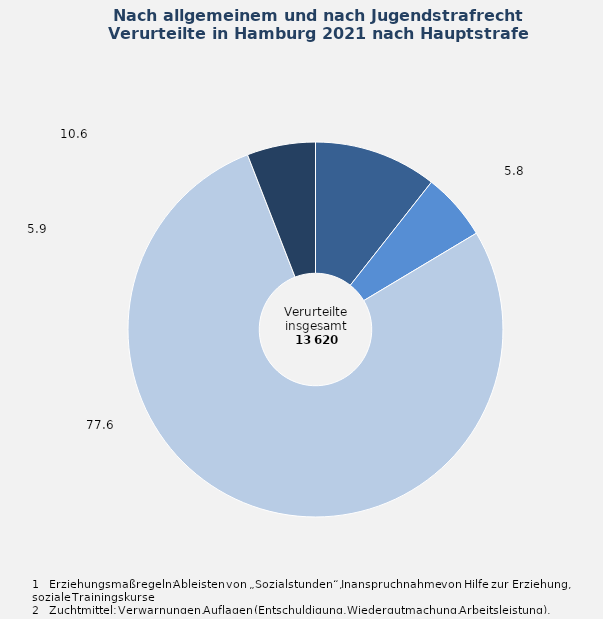
| Category | Anteil in Prozent |
|---|---|
| Freiheits- /Jugendstrafe mit 
Strafaussetzung zur Bewährung | 10.6 |
| Freiheits- /Jugendstrafe ohne 
Strafaussetzung zur Bewährung | 5.8 |
| Geldstrafe | 77.6 |
| Erziehungsmaßregeln¹, Zuchtmittel² | 5.9 |